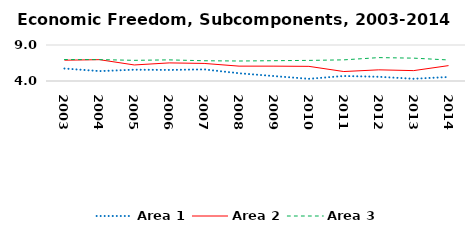
| Category | Area 1 | Area 2 | Area 3 |
|---|---|---|---|
| 2003.0 | 5.735 | 6.887 | 6.98 |
| 2004.0 | 5.377 | 6.963 | 6.972 |
| 2005.0 | 5.567 | 6.228 | 6.871 |
| 2006.0 | 5.537 | 6.514 | 6.934 |
| 2007.0 | 5.609 | 6.44 | 6.812 |
| 2008.0 | 5.075 | 6.066 | 6.778 |
| 2009.0 | 4.682 | 6.063 | 6.819 |
| 2010.0 | 4.302 | 6.035 | 6.862 |
| 2011.0 | 4.696 | 5.314 | 6.936 |
| 2012.0 | 4.585 | 5.55 | 7.249 |
| 2013.0 | 4.312 | 5.443 | 7.176 |
| 2014.0 | 4.558 | 6.136 | 6.92 |